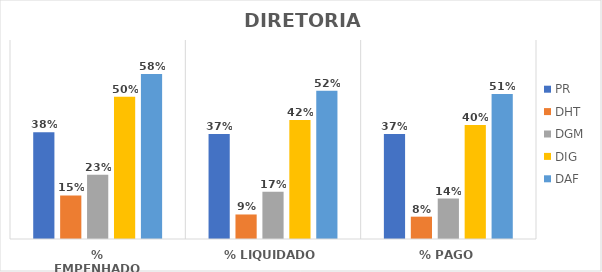
| Category | PR | DHT | DGM | DIG | DAF |
|---|---|---|---|---|---|
| % EMPENHADO | 0.376 | 0.153 | 0.226 | 0.5 | 0.581 |
| % LIQUIDADO | 0.369 | 0.086 | 0.166 | 0.419 | 0.521 |
| % PAGO | 0.369 | 0.079 | 0.142 | 0.401 | 0.51 |